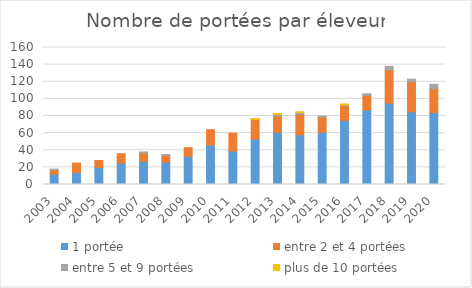
| Category | 1 portée | entre 2 et 4 portées | entre 5 et 9 portées | plus de 10 portées |
|---|---|---|---|---|
| 2003.0 | 12 | 5 | 1 | 0 |
| 2004.0 | 14 | 11 | 0 | 0 |
| 2005.0 | 20 | 8 | 0 | 0 |
| 2006.0 | 25 | 11 | 0 | 0 |
| 2007.0 | 27 | 10 | 1 | 0 |
| 2008.0 | 26 | 8 | 1 | 0 |
| 2009.0 | 33 | 10 | 0 | 0 |
| 2010.0 | 46 | 18 | 0 | 0 |
| 2011.0 | 39 | 21 | 0 | 0 |
| 2012.0 | 53 | 23 | 0 | 1 |
| 2013.0 | 61 | 19 | 2 | 1 |
| 2014.0 | 58 | 24 | 2 | 1 |
| 2015.0 | 61 | 18 | 1 | 0 |
| 2016.0 | 75 | 17 | 1 | 1 |
| 2017.0 | 87 | 17 | 2 | 0 |
| 2018.0 | 95 | 39 | 4 | 0 |
| 2019.0 | 85 | 35 | 3 | 0 |
| 2020.0 | 84 | 28 | 5 | 0 |